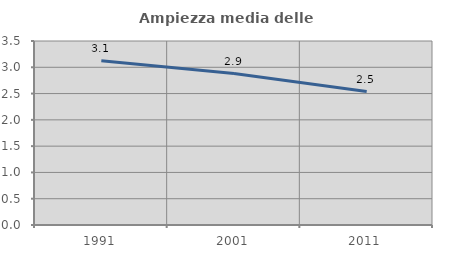
| Category | Ampiezza media delle famiglie |
|---|---|
| 1991.0 | 3.126 |
| 2001.0 | 2.881 |
| 2011.0 | 2.538 |